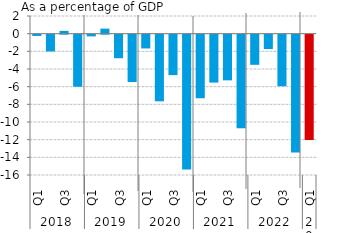
| Category | Series 0 |
|---|---|
| 0 | -0.146 |
| 1 | -1.897 |
| 2 | 0.317 |
| 3 | -5.898 |
| 4 | -0.194 |
| 5 | 0.571 |
| 6 | -2.668 |
| 7 | -5.365 |
| 8 | -1.559 |
| 9 | -7.546 |
| 10 | -4.579 |
| 11 | -15.27 |
| 12 | -7.199 |
| 13 | -5.425 |
| 14 | -5.172 |
| 15 | -10.595 |
| 16 | -3.414 |
| 17 | -1.628 |
| 18 | -5.837 |
| 19 | -13.343 |
| 20 | -11.932 |